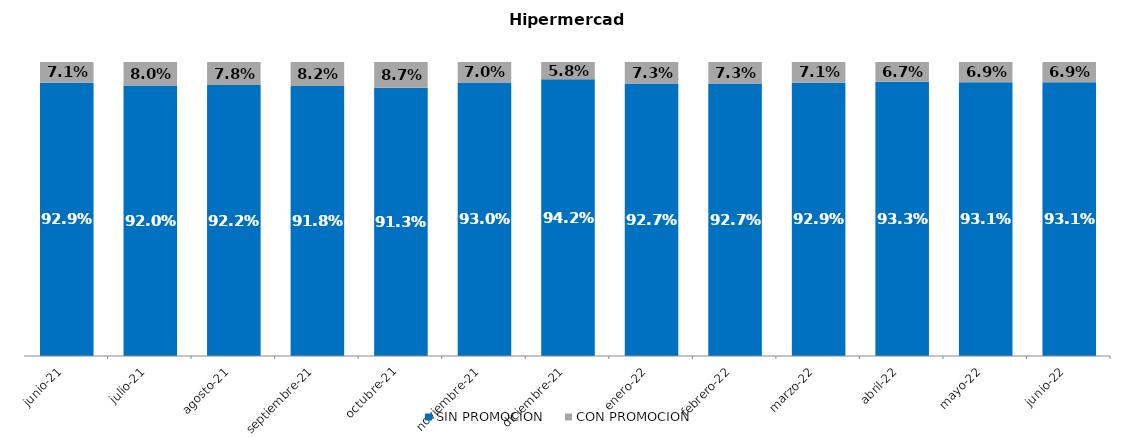
| Category | SIN PROMOCION   | CON PROMOCION   |
|---|---|---|
| 2021-06-01 | 0.929 | 0.071 |
| 2021-07-01 | 0.92 | 0.08 |
| 2021-08-01 | 0.922 | 0.078 |
| 2021-09-01 | 0.918 | 0.082 |
| 2021-10-01 | 0.913 | 0.087 |
| 2021-11-01 | 0.93 | 0.07 |
| 2021-12-01 | 0.942 | 0.058 |
| 2022-01-01 | 0.927 | 0.073 |
| 2022-02-01 | 0.927 | 0.073 |
| 2022-03-01 | 0.929 | 0.071 |
| 2022-04-01 | 0.933 | 0.067 |
| 2022-05-01 | 0.931 | 0.069 |
| 2022-06-01 | 0.931 | 0.069 |